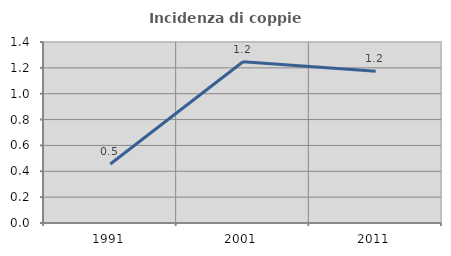
| Category | Incidenza di coppie miste |
|---|---|
| 1991.0 | 0.457 |
| 2001.0 | 1.247 |
| 2011.0 | 1.173 |